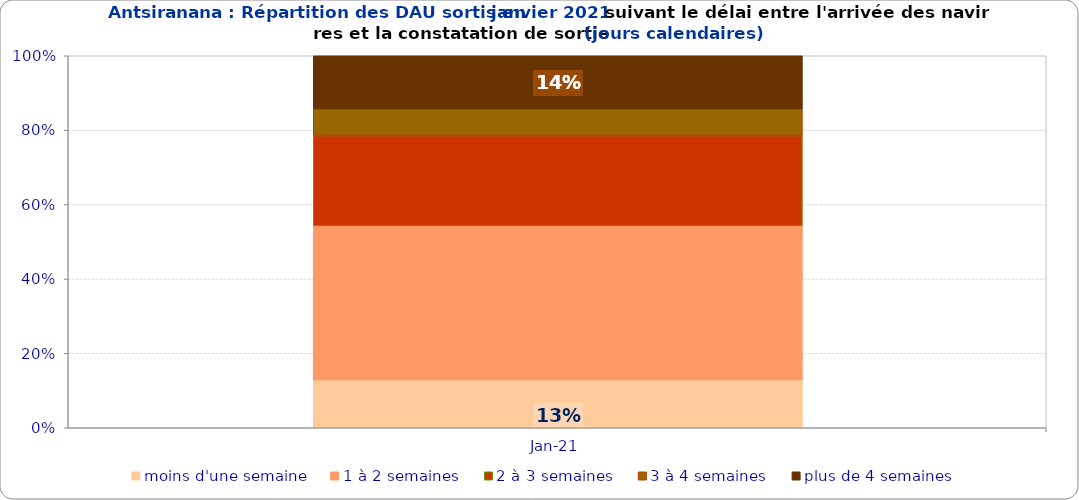
| Category | moins d'une semaine | 1 à 2 semaines | 2 à 3 semaines | 3 à 4 semaines | plus de 4 semaines |
|---|---|---|---|---|---|
| 2021-01-01 | 0.129 | 0.414 | 0.243 | 0.071 | 0.143 |